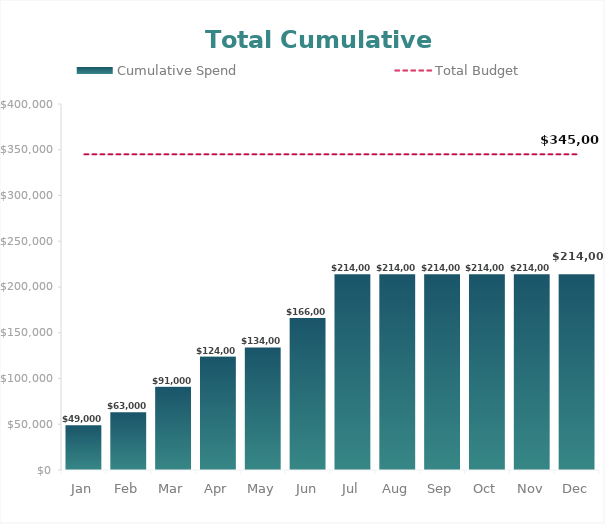
| Category | Cumulative Spend |
|---|---|
| Jan | 49000 |
| Feb | 63000 |
| Mar | 91000 |
| Apr | 124000 |
| May | 134000 |
| Jun | 166000 |
| Jul | 214000 |
| Aug | 214000 |
| Sep | 214000 |
| Oct | 214000 |
| Nov | 214000 |
| Dec | 214000 |